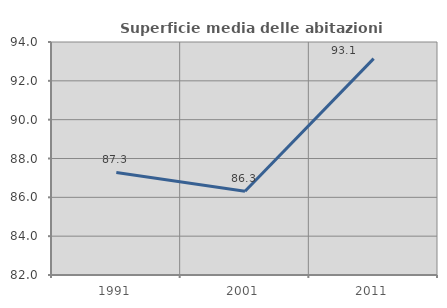
| Category | Superficie media delle abitazioni occupate |
|---|---|
| 1991.0 | 87.284 |
| 2001.0 | 86.31 |
| 2011.0 | 93.144 |